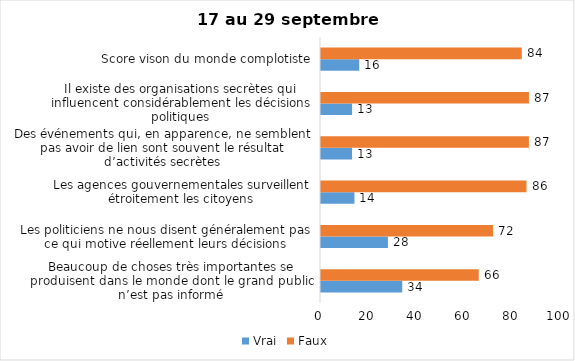
| Category | Vrai | Faux |
|---|---|---|
| Beaucoup de choses très importantes se produisent dans le monde dont le grand public n’est pas informé | 34 | 66 |
| Les politiciens ne nous disent généralement pas ce qui motive réellement leurs décisions | 28 | 72 |
| Les agences gouvernementales surveillent étroitement les citoyens | 14 | 86 |
| Des événements qui, en apparence, ne semblent pas avoir de lien sont souvent le résultat d’activités secrètes | 13 | 87 |
| Il existe des organisations secrètes qui influencent considérablement les décisions politiques | 13 | 87 |
| Score vison du monde complotiste | 16 | 84 |